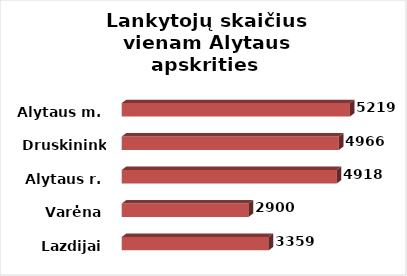
| Category | Series 0 |
|---|---|
| Lazdijai | 3359.083 |
| Varėna | 2900.25 |
| Alytaus r. | 4917.529 |
| Druskininkai | 4966.211 |
| Alytaus m. | 5218.731 |